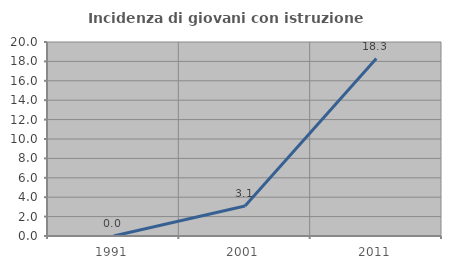
| Category | Incidenza di giovani con istruzione universitaria |
|---|---|
| 1991.0 | 0 |
| 2001.0 | 3.093 |
| 2011.0 | 18.293 |